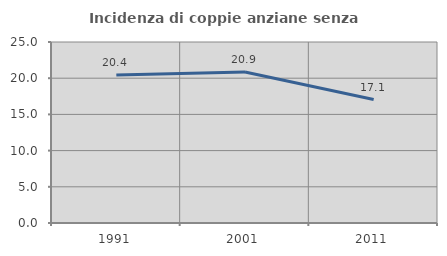
| Category | Incidenza di coppie anziane senza figli  |
|---|---|
| 1991.0 | 20.442 |
| 2001.0 | 20.859 |
| 2011.0 | 17.054 |